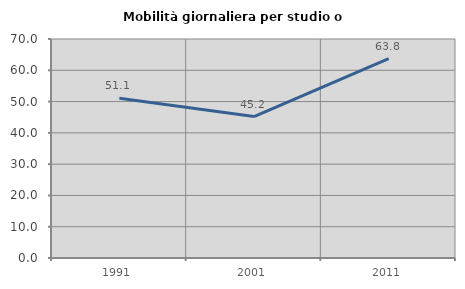
| Category | Mobilità giornaliera per studio o lavoro |
|---|---|
| 1991.0 | 51.073 |
| 2001.0 | 45.205 |
| 2011.0 | 63.761 |